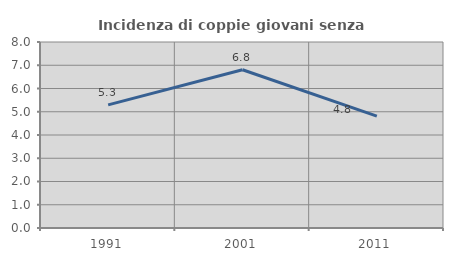
| Category | Incidenza di coppie giovani senza figli |
|---|---|
| 1991.0 | 5.294 |
| 2001.0 | 6.806 |
| 2011.0 | 4.813 |